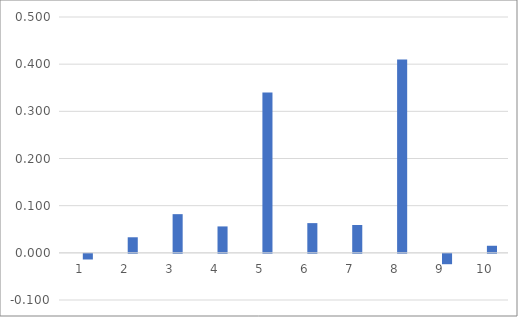
| Category | Series 1 | Series 0 |
|---|---|---|
| 0 | 0 | -0.012 |
| 1 | 0 | 0.033 |
| 2 | 0 | 0.082 |
| 3 | 0 | 0.056 |
| 4 | 0 | 0.34 |
| 5 | 0 | 0.063 |
| 6 | 0 | 0.059 |
| 7 | 0 | 0.41 |
| 8 | 0 | -0.022 |
| 9 | 0 | 0.015 |